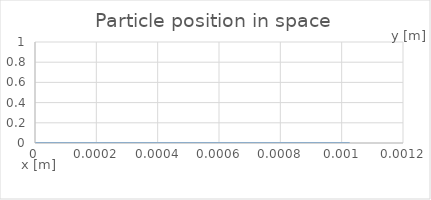
| Category | Position |
|---|---|
| 0.0 | 0 |
| 1.0849708527211375e-06 | 0 |
| 2.0657940694101187e-06 | 0 |
| 2.95841799307969e-06 | 0 |
| 3.807688500268434e-06 | 0 |
| 4.6528456158184445e-06 | 0 |
| 5.515061530573464e-06 | 0 |
| 6.398412354118242e-06 | 0 |
| 7.2631853016606325e-06 | 0 |
| 8.149474777894756e-06 | 0 |
| 9.06891409328116e-06 | 0 |
| 1.001395492328489e-05 | 0 |
| 1.0970207049510458e-05 | 0 |
| 1.1925712499326183e-05 | 0 |
| 1.2874813678204127e-05 | 0 |
| 1.3817397214790802e-05 | 0 |
| 1.4756151180294727e-05 | 0 |
| 1.5694021919839908e-05 | 0 |
| 1.6632881993865335e-05 | 0 |
| 1.7573248578469382e-05 | 0 |
| 1.851474282102202e-05 | 0 |
| 1.945669407357349e-05 | 0 |
| 2.0398567234390694e-05 | 0 |
| 2.1340122745158912e-05 | 0 |
| 2.2281366889895705e-05 | 0 |
| 2.322242795579233e-05 | 0 |
| 2.4163440636364245e-05 | 0 |
| 2.5104487780952476e-05 | 0 |
| 2.6045586222522e-05 | 0 |
| 2.698671658315851e-05 | 0 |
| 2.792784457173047e-05 | 0 |
| 2.8868948392686187e-05 | 0 |
| 2.9810020244844562e-05 | 0 |
| 3.07510649032022e-05 | 0 |
| 3.169208682441906e-05 | 0 |
| 3.2633094216652706e-05 | 0 |
| 3.357408734569741e-05 | 0 |
| 3.4515067902574924e-05 | 0 |
| 3.5456033142234034e-05 | 0 |
| 3.639698281603354e-05 | 0 |
| 3.7337916092579194e-05 | 0 |
| 3.827883270087771e-05 | 0 |
| 3.921973392364139e-05 | 0 |
| 4.016062871923654e-05 | 0 |
| 4.1101521575132224e-05 | 0 |
| 4.2042406336622134e-05 | 0 |
| 4.298327871609407e-05 | 0 |
| 4.3924136106745105e-05 | 0 |
| 4.486497587201077e-05 | 0 |
| 4.5805796906071405e-05 | 0 |
| 4.674660122910131e-05 | 0 |
| 4.768739000289194e-05 | 0 |
| 4.862816200557467e-05 | 0 |
| 4.9568919923315804e-05 | 0 |
| 5.050966366069588e-05 | 0 |
| 5.145039302596966e-05 | 0 |
| 5.2391228358878946e-05 | 0 |
| 5.3332177263615086e-05 | 0 |
| 5.427319118135362e-05 | 0 |
| 5.521421094729839e-05 | 0 |
| 5.615519656296111e-05 | 0 |
| 5.7096146549592635e-05 | 0 |
| 5.803706898391094e-05 | 0 |
| 5.897796395640177e-05 | 0 |
| 5.991883465092693e-05 | 0 |
| 6.0859121547263277e-05 | 0 |
| 6.179878641651572e-05 | 0 |
| 6.273804878815809e-05 | 0 |
| 6.367720665766775e-05 | 0 |
| 6.46164334151532e-05 | 0 |
| 6.555578018990172e-05 | 0 |
| 6.649521725106576e-05 | 0 |
| 6.743468239568371e-05 | 0 |
| 6.837412915709868e-05 | 0 |
| 6.931353460281128e-05 | 0 |
| 7.02531285715835e-05 | 0 |
| 7.119294232869318e-05 | 0 |
| 7.213246735481581e-05 | 0 |
| 7.307153353891135e-05 | 0 |
| 7.401024099773768e-05 | 0 |
| 7.494878540912699e-05 | 0 |
| 7.588732314938814e-05 | 0 |
| 7.682593150848681e-05 | 0 |
| 7.7764611490593e-05 | 0 |
| 7.870332796225495e-05 | 0 |
| 7.964204114813501e-05 | 0 |
| 8.058068668913666e-05 | 0 |
| 8.151908388044625e-05 | 0 |
| 8.245723931176603e-05 | 0 |
| 8.33952489781963e-05 | 0 |
| 8.433321759970894e-05 | 0 |
| 8.527120752250843e-05 | 0 |
| 8.620923472438315e-05 | 0 |
| 8.7147284907374e-05 | 0 |
| 8.808533430447047e-05 | 0 |
| 8.902336658674276e-05 | 0 |
| 8.996137408306554e-05 | 0 |
| 9.089940657328803e-05 | 0 |
| 9.183747085678422e-05 | 0 |
| 9.277555100030863e-05 | 0 |
| 9.371362719129207e-05 | 0 |
| 9.465168349322245e-05 | 0 |
| 9.5589713824809e-05 | 0 |
| 9.6527719598304e-05 | 0 |
| 9.746566553629115e-05 | 0 |
| 9.840355357504977e-05 | 0 |
| 9.934140250533372e-05 | 0 |
| 0.00010027923048989885 | 0 |
| 0.00010121704892739054 | 0 |
| 0.00010215486069824894 | 0 |
| 0.00010309266330946785 | 0 |
| 0.00010403045458420995 | 0 |
| 0.00010496823005482635 | 0 |
| 0.00010590598685176727 | 0 |
| 0.0001068437241060166 | 0 |
| 0.00010778144337926773 | 0 |
| 0.00010871914595847138 | 0 |
| 0.00010965683263975685 | 0 |
| 0.0001105945041732376 | 0 |
| 0.00011153215605715231 | 0 |
| 0.00011246978772630278 | 0 |
| 0.00011340740181779955 | 0 |
| 0.00011434500014089241 | 0 |
| 0.00011528261106181216 | 0 |
| 0.00011622030374655903 | 0 |
| 0.00011715807252590486 | 0 |
| 0.00011809587629748863 | 0 |
| 0.00011903367245038118 | 0 |
| 0.00011997143499540204 | 0 |
| 0.0001209091595223687 | 0 |
| 0.00012184685276228505 | 0 |
| 0.00012278452420301796 | 0 |
| 0.00012372218233953805 | 0 |
| 0.000124659830640406 | 0 |
| 0.00012559746786599567 | 0 |
| 0.00012653509243374585 | 0 |
| 0.00012747269790130478 | 0 |
| 0.00012841029039815653 | 0 |
| 0.00012934774543789078 | 0 |
| 0.00013028505273619294 | 0 |
| 0.00013122211147667296 | 0 |
| 0.00013215896826201636 | 0 |
| 0.00013309572510635691 | 0 |
| 0.0001340324686887363 | 0 |
| 0.00013496923942736327 | 0 |
| 0.00013590604004524637 | 0 |
| 0.00013684284584133347 | 0 |
| 0.00013777963609219447 | 0 |
| 0.00013871640086828593 | 0 |
| 0.00013965313822566423 | 0 |
| 0.000140589853571836 | 0 |
| 0.00014152655167057592 | 0 |
| 0.0001424632335333743 | 0 |
| 0.0001433998999404217 | 0 |
| 0.00014433655155678913 | 0 |
| 0.00014527318798320758 | 0 |
| 0.00014620335687511696 | 0 |
| 0.00014712651893786672 | 0 |
| 0.00014804529881639407 | 0 |
| 0.00014896280420165957 | 0 |
| 0.0001498811028998539 | 0 |
| 0.0001508008979395992 | 0 |
| 0.00015172192145826552 | 0 |
| 0.000152656057434416 | 0 |
| 0.00015360379436791564 | 0 |
| 0.000154559656213673 | 0 |
| 0.00015551744617722574 | 0 |
| 0.000156473235906426 | 0 |
| 0.0001574259071782128 | 0 |
| 0.00015837621620307785 | 0 |
| 0.00015932553820690378 | 0 |
| 0.00016027497396481488 | 0 |
| 0.00016122501939005676 | 0 |
| 0.00016220292424044206 | 0 |
| 0.00016321031952250218 | 0 |
| 0.00016423494633819517 | 0 |
| 0.00016526285352261985 | 0 |
| 0.00016628555832144603 | 0 |
| 0.0001673011931898251 | 0 |
| 0.00016831203553360817 | 0 |
| 0.00016932138633747202 | 0 |
| 0.00017033156291650352 | 0 |
| 0.00017134334011546687 | 0 |
| 0.00017235637751029863 | 0 |
| 0.0001733699295910405 | 0 |
| 0.00017438338480428012 | 0 |
| 0.0001753964747399114 | 0 |
| 0.00017640922311433407 | 0 |
| 0.00017742178893696343 | 0 |
| 0.00017843433070769012 | 0 |
| 0.00017944693273531253 | 0 |
| 0.0001804596119912956 | 0 |
| 0.00018147233517130208 | 0 |
| 0.00018248505655068956 | 0 |
| 0.00018349774984497062 | 0 |
| 0.00018451040780962283 | 0 |
| 0.0001855230367580014 | 0 |
| 0.00018653564720953503 | 0 |
| 0.00018754824609096719 | 0 |
| 0.00018856083524440253 | 0 |
| 0.0001895734155546879 | 0 |
| 0.00019058598455294403 | 0 |
| 0.00019159853920194169 | 0 |
| 0.00019261107859578283 | 0 |
| 0.0001936236043486347 | 0 |
| 0.00019463611731642438 | 0 |
| 0.00019564861635809272 | 0 |
| 0.00019668248552275319 | 0 |
| 0.00019775610373996992 | 0 |
| 0.00019885995142041325 | 0 |
| 0.00019997456814416489 | 0 |
| 0.0002010848804515392 | 0 |
| 0.00020218547958004523 | 0 |
| 0.00020327844395698902 | 0 |
| 0.00020437557105147943 | 0 |
| 0.00020548071320839712 | 0 |
| 0.00020659184723450117 | 0 |
| 0.00020770498667400193 | 0 |
| 0.00020881713258545705 | 0 |
| 0.00020992726837595126 | 0 |
| 0.0002110358713316323 | 0 |
| 0.00021214392669178112 | 0 |
| 0.00021325218773596966 | 0 |
| 0.00021436091686350255 | 0 |
| 0.00021547000419360184 | 0 |
| 0.00021657921770806425 | 0 |
| 0.00021768836559171904 | 0 |
| 0.0002187973748961724 | 0 |
| 0.00021990626605217104 | 0 |
| 0.00022101509701441668 | 0 |
| 0.000222123917616828 | 0 |
| 0.00022323274556007623 | 0 |
| 0.00022434157440713392 | 0 |
| 0.000225450390030715 | 0 |
| 0.000226559178778232 | 0 |
| 0.000227667937644675 | 0 |
| 0.0002287766699292555 | 0 |
| 0.000229885379194745 | 0 |
| 0.00023099410656091235 | 0 |
| 0.00023210293694940574 | 0 |
| 0.00023321185026446698 | 0 |
| 0.00023432078420322373 | 0 |
| 0.00023542967587982238 | 0 |
| 0.00023653850324224579 | 0 |
| 0.00023764727865428767 | 0 |
| 0.00023874810650296763 | 0 |
| 0.00023984095251468833 | 0 |
| 0.00024092969608032955 | 0 |
| 0.00024201826826971115 | 0 |
| 0.00024310870561982908 | 0 |
| 0.0002442011253584686 | 0 |
| 0.00024529461153917326 | 0 |
| 0.0002463881725279977 | 0 |
| 0.0002474812668309382 | 0 |
| 0.00024857384522029315 | 0 |
| 0.0002496661143324798 | 0 |
| 0.0002507583185810692 | 0 |
| 0.00025185060404824493 | 0 |
| 0.0002528946618471488 | 0 |
| 0.0002538724375607984 | 0 |
| 0.00025481329225903186 | 0 |
| 0.00025572968892534196 | 0 |
| 0.0002566379900219161 | 0 |
| 0.00025754966487661956 | 0 |
| 0.00025846905564946897 | 0 |
| 0.0002593951701734181 | 0 |
| 0.00026032473785507645 | 0 |
| 0.00026125468572395124 | 0 |
| 0.00026218331125392463 | 0 |
| 0.00026311030706394376 | 0 |
| 0.00026403617546914046 | 0 |
| 0.00026496162749497945 | 0 |
| 0.0002658871852695946 | 0 |
| 0.00026681305585216065 | 0 |
| 0.0002677392058996091 | 0 |
| 0.00026866549672901135 | 0 |
| 0.00026959179238588864 | 0 |
| 0.0002705180170249279 | 0 |
| 0.00027144415561627326 | 0 |
| 0.0002723702274613146 | 0 |
| 0.0002732962625332174 | 0 |
| 0.0002742222866915458 | 0 |
| 0.0002751483108629217 | 0 |
| 0.00027607433259426253 | 0 |
| 0.000277000344247191 | 0 |
| 0.000277926340679755 | 0 |
| 0.00027885231623238165 | 0 |
| 0.0002797782701126585 | 0 |
| 0.0002807039096013685 | 0 |
| 0.0002816292102277968 | 0 |
| 0.00028255429379332584 | 0 |
| 0.0002834793023178841 | 0 |
| 0.0002844043304573562 | 0 |
| 0.00028532941202762016 | 0 |
| 0.00028625453457808866 | 0 |
| 0.0002871796660336826 | 0 |
| 0.00028810478046086647 | 0 |
| 0.00028902986604089064 | 0 |
| 0.00028995492073874933 | 0 |
| 0.000290879949110922 | 0 |
| 0.0002918049579667334 | 0 |
| 0.0002927299518309573 | 0 |
| 0.0002936549323519714 | 0 |
| 0.00029457989937142044 | 0 |
| 0.0002955048485871665 | 0 |
| 0.00029642978050686017 | 0 |
| 0.0002973546954341784 | 0 |
| 0.00029827959405329503 | 0 |
| 0.0002992044754083915 | 0 |
| 0.0003001293386422276 | 0 |
| 0.00030105417205932277 | 0 |
| 0.0003019789220634248 | 0 |
| 0.0003029035978271135 | 0 |
| 0.00030382822560546624 | 0 |
| 0.0003047528313451618 | 0 |
| 0.0003056774320159479 | 0 |
| 0.0003066020305679692 | 0 |
| 0.0003075266222794467 | 0 |
| 0.0003084512005679024 | 0 |
| 0.0003093937389795628 | 0 |
| 0.0003103557282650236 | 0 |
| 0.00031132964992261036 | 0 |
| 0.00031230657972979156 | 0 |
| 0.00031326275769383153 | 0 |
| 0.00031419525169156974 | 0 |
| 0.00031513054947128374 | 0 |
| 0.00031608072073027255 | 0 |
| 0.00031704553540723066 | 0 |
| 0.00031801861909680425 | 0 |
| 0.00031899320189316576 | 0 |
| 0.00031996523996449084 | 0 |
| 0.00032093381122571987 | 0 |
| 0.00032189994758064525 | 0 |
| 0.00032286521035646476 | 0 |
| 0.0003238306984450858 | 0 |
| 0.00032479685790509584 | 0 |
| 0.000325763612971166 | 0 |
| 0.00032673066379353236 | 0 |
| 0.00032769772437419605 | 0 |
| 0.0003286646409096528 | 0 |
| 0.0003296313906750748 | 0 |
| 0.0003305800452206826 | 0 |
| 0.0003315093659207195 | 0 |
| 0.0003324268311123679 | 0 |
| 0.00033334106141168094 | 0 |
| 0.0003342576809068817 | 0 |
| 0.00033517851903254025 | 0 |
| 0.00033610275203974684 | 0 |
| 0.00033704654614495643 | 0 |
| 0.0003380098246078967 | 0 |
| 0.0003389842463992511 | 0 |
| 0.0003399428299331851 | 0 |
| 0.0003408968950353098 | 0 |
| 0.00034183603805604723 | 0 |
| 0.00034277934179384635 | 0 |
| 0.00034373459373720827 | 0 |
| 0.00034470061448675345 | 0 |
| 0.0003456721903624417 | 0 |
| 0.0003466263190856998 | 0 |
| 0.0003475589902560722 | 0 |
| 0.0003484772294016648 | 0 |
| 0.0003493905018279771 | 0 |
| 0.0003503055642018231 | 0 |
| 0.0003512250549339236 | 0 |
| 0.0003521664607953938 | 0 |
| 0.00035312941500016654 | 0 |
| 0.00035408658187410173 | 0 |
| 0.0003550267685999451 | 0 |
| 0.0003559695491945957 | 0 |
| 0.0003569236074259575 | 0 |
| 0.0003578885052253955 | 0 |
| 0.00035885937247560467 | 0 |
| 0.000359813509943091 | 0 |
| 0.00036078569191687473 | 0 |
| 0.0003617855364440112 | 0 |
| 0.0003628058701753597 | 0 |
| 0.00036382336656301393 | 0 |
| 0.00036482764537544343 | 0 |
| 0.0003658194714314465 | 0 |
| 0.00036680476372258537 | 0 |
| 0.00036778935784459774 | 0 |
| 0.00036877732075312776 | 0 |
| 0.0003697747502047238 | 0 |
| 0.0003707804940270399 | 0 |
| 0.0003717902491386285 | 0 |
| 0.00037280005142978253 | 0 |
| 0.00037380788780631423 | 0 |
| 0.0003748344773244411 | 0 |
| 0.0003758816549137392 | 0 |
| 0.0003769408001138927 | 0 |
| 0.0003780019691031074 | 0 |
| 0.0003790592228490721 | 0 |
| 0.0003801114356822483 | 0 |
| 0.0003811604088472831 | 0 |
| 0.0003822085548089374 | 0 |
| 0.0003832574572082597 | 0 |
| 0.0003843075460798974 | 0 |
| 0.0003853584704305074 | 0 |
| 0.0003864096567476039 | 0 |
| 0.00038746068616023357 | 0 |
| 0.00038851141387277494 | 0 |
| 0.00038956190777659583 | 0 |
| 0.0003906123030348995 | 0 |
| 0.0003916627089447929 | 0 |
| 0.00039271316120087057 | 0 |
| 0.00039376364928780255 | 0 |
| 0.0003948141431529998 | 0 |
| 0.00039586461370359847 | 0 |
| 0.00039691504817177843 | 0 |
| 0.00039796544942987723 | 0 |
| 0.0003990158273225588 | 0 |
| 0.00040006620061142344 | 0 |
| 0.0004011165732783904 | 0 |
| 0.00040216693901092866 | 0 |
| 0.0004032172892690418 | 0 |
| 0.0004042676203766555 | 0 |
| 0.0004053179314866976 | 0 |
| 0.00040636822111281073 | 0 |
| 0.0004074184899716926 | 0 |
| 0.0004084687495689362 | 0 |
| 0.0004095190003376968 | 0 |
| 0.00041056923833836495 | 0 |
| 0.00041161945750562 | 0 |
| 0.0004126696572190898 | 0 |
| 0.00041371983832866034 | 0 |
| 0.00041477624541827853 | 0 |
| 0.0004158390814356193 | 0 |
| 0.00041690684023090594 | 0 |
| 0.00041797642066915627 | 0 |
| 0.0004190453944892372 | 0 |
| 0.0004201128267371434 | 0 |
| 0.00042117897692529145 | 0 |
| 0.00042224457850155385 | 0 |
| 0.0004233102491388248 | 0 |
| 0.00042437626857725675 | 0 |
| 0.0004254426022181635 | 0 |
| 0.0004265090775343032 | 0 |
| 0.00042757553252973854 | 0 |
| 0.000428641889171025 | 0 |
| 0.0004297081782902127 | 0 |
| 0.00043077444052240786 | 0 |
| 0.0004318407033330355 | 0 |
| 0.00043290697195475734 | 0 |
| 0.0004339732365286488 | 0 |
| 0.000435039483585572 | 0 |
| 0.0004360927119958646 | 0 |
| 0.0004371325710763894 | 0 |
| 0.00043816511981250753 | 0 |
| 0.0004391967593045066 | 0 |
| 0.0004402310981229751 | 0 |
| 0.0004412686845757861 | 0 |
| 0.000442308266513615 | 0 |
| 0.00044334826162177517 | 0 |
| 0.0004443876779106009 | 0 |
| 0.0004454262790434599 | 0 |
| 0.0004464643125164579 | 0 |
| 0.00044750215488249107 | 0 |
| 0.0004485400719940131 | 0 |
| 0.00044957816509459225 | 0 |
| 0.00045061639432910646 | 0 |
| 0.00045165463418179866 | 0 |
| 0.0004526928074387048 | 0 |
| 0.0004537308941720292 | 0 |
| 0.0004547689164120408 | 0 |
| 0.0004558069044419628 | 0 |
| 0.00045684487923201877 | 0 |
| 0.00045788284593058215 | 0 |
| 0.0004589213387903405 | 0 |
| 0.0004599603712179416 | 0 |
| 0.0004609996904024617 | 0 |
| 0.00046203902655909815 | 0 |
| 0.00046307822626747114 | 0 |
| 0.00046411726655462836 | 0 |
| 0.0004651561990653229 | 0 |
| 0.00046619495512798193 | 0 |
| 0.0004672335706841348 | 0 |
| 0.0004682721189828084 | 0 |
| 0.0004693106581269589 | 0 |
| 0.0004703492131881507 | 0 |
| 0.00047138777903659834 | 0 |
| 0.00047241777534655425 | 0 |
| 0.0004734388582047499 | 0 |
| 0.0004744634723576026 | 0 |
| 0.00047548765895815873 | 0 |
| 0.0004765181802632035 | 0 |
| 0.0004775555038033277 | 0 |
| 0.000478596709703994 | 0 |
| 0.00047963852390835686 | 0 |
| 0.0004806790092283924 | 0 |
| 0.00048171780393458145 | 0 |
| 0.00048275550180527 | 0 |
| 0.0004837928977813441 | 0 |
| 0.0004848305188944097 | 0 |
| 0.00048586850351026287 | 0 |
| 0.00048690674192908447 | 0 |
| 0.000487945052818444 | 0 |
| 0.000488995638025577 | 0 |
| 0.0004900588648544134 | 0 |
| 0.0004911289418824655 | 0 |
| 0.0004921997049534127 | 0 |
| 0.0004932553892364242 | 0 |
| 0.0004942952583614715 | 0 |
| 0.0004953386838781463 | 0 |
| 0.000496393689404651 | 0 |
| 0.0004974379776793254 | 0 |
| 0.0004984565173895105 | 0 |
| 0.0004994319044419446 | 0 |
| 0.0005003746332535534 | 0 |
| 0.000501352163361431 | 0 |
| 0.0005023833000379661 | 0 |
| 0.0005034534040243128 | 0 |
| 0.0005044886165992881 | 0 |
| 0.0005054683936941631 | 0 |
| 0.0005064073847652898 | 0 |
| 0.0005073303726099725 | 0 |
| 0.0005082563883984796 | 0 |
| 0.0005091936893418729 | 0 |
| 0.0005101417029696006 | 0 |
| 0.0005111173591191004 | 0 |
| 0.0005120955110245536 | 0 |
| 0.0005130842232664966 | 0 |
| 0.0005140828848912366 | 0 |
| 0.0005150867661761454 | 0 |
| 0.0005160911585683277 | 0 |
| 0.0005170938515205168 | 0 |
| 0.0005180944905399574 | 0 |
| 0.0005190938065451944 | 0 |
| 0.000520092747687208 | 0 |
| 0.0005210919444866936 | 0 |
| 0.0005220915898011962 | 0 |
| 0.0005230915684124391 | 0 |
| 0.0005240916657316431 | 0 |
| 0.0005250917121169215 | 0 |
| 0.000526091630153685 | 0 |
| 0.0005271179543298027 | 0 |
| 0.0005281454760498949 | 0 |
| 0.0005291610295941638 | 0 |
| 0.000530163488393859 | 0 |
| 0.000531158175329052 | 0 |
| 0.0005321512060270486 | 0 |
| 0.000533146366662884 | 0 |
| 0.0005341445966347909 | 0 |
| 0.0005351449901053378 | 0 |
| 0.000536146243408051 | 0 |
| 0.0005371473135413811 | 0 |
| 0.0005381477515706092 | 0 |
| 0.0005391521587817222 | 0 |
| 0.0005401610524176664 | 0 |
| 0.000541172666739829 | 0 |
| 0.0005421848794952897 | 0 |
| 0.0005431963509947727 | 0 |
| 0.0005442067376005659 | 0 |
| 0.000545216258201924 | 0 |
| 0.0005462254057572976 | 0 |
| 0.0005472345850212189 | 0 |
| 0.000548243987388968 | 0 |
| 0.0005492536115221365 | 0 |
| 0.0005502633480935962 | 0 |
| 0.0005512730837752877 | 0 |
| 0.0005522827519585859 | 0 |
| 0.0005532923364843668 | 0 |
| 0.0005543018571442201 | 0 |
| 0.0005553113107645118 | 0 |
| 0.0005563207145818798 | 0 |
| 0.0005573300757916557 | 0 |
| 0.0005583652413406508 | 0 |
| 0.0005594273454643009 | 0 |
| 0.0005604930146162929 | 0 |
| 0.0005615488610732684 | 0 |
| 0.0005625928314722628 | 0 |
| 0.0005636294546264133 | 0 |
| 0.0005646643978624027 | 0 |
| 0.0005657012619075148 | 0 |
| 0.0005667409510745161 | 0 |
| 0.0005677825957516032 | 0 |
| 0.0005688248442703774 | 0 |
| 0.0005698667364082559 | 0 |
| 0.0005709079471449678 | 0 |
| 0.0005719486197666064 | 0 |
| 0.0005729890639348637 | 0 |
| 0.0005740295335044588 | 0 |
| 0.0005750701321405549 | 0 |
| 0.0005761108435891087 | 0 |
| 0.0005771515983006686 | 0 |
| 0.000578192332955731 | 0 |
| 0.0005792330139205266 | 0 |
| 0.0005802736392950893 | 0 |
| 0.0005813142232066276 | 0 |
| 0.0005823547837539233 | 0 |
| 0.0005833953434148248 | 0 |
| 0.0005844359038239512 | 0 |
| 0.000585476457025068 | 0 |
| 0.0005865169894802233 | 0 |
| 0.0005875574958216277 | 0 |
| 0.0005885968686863951 | 0 |
| 0.0005896350696656305 | 0 |
| 0.0005906726145692991 | 0 |
| 0.0005917100566166812 | 0 |
| 0.0005927496115798286 | 0 |
| 0.0005937917938023644 | 0 |
| 0.0005948356303214034 | 0 |
| 0.000595879855370152 | 0 |
| 0.0005969236564193073 | 0 |
| 0.0005979668169723508 | 0 |
| 0.0005990095181660698 | 0 |
| 0.0006000520527826886 | 0 |
| 0.0006010946886535659 | 0 |
| 0.0006021375023489817 | 0 |
| 0.0006031804389803584 | 0 |
| 0.0006042234068022805 | 0 |
| 0.0006052663362075979 | 0 |
| 0.0006063091996437701 | 0 |
| 0.0006073520053691638 | 0 |
| 0.0006083947725674751 | 0 |
| 0.0006094375188682057 | 0 |
| 0.000610480260814885 | 0 |
| 0.0006115230079043493 | 0 |
| 0.0006125657514345171 | 0 |
| 0.0006136084798065535 | 0 |
| 0.0006146511863393097 | 0 |
| 0.0006156938677898507 | 0 |
| 0.0006167365250380022 | 0 |
| 0.0006177791591576875 | 0 |
| 0.0006187743750112638 | 0 |
| 0.000619720031059838 | 0 |
| 0.0006206365173432752 | 0 |
| 0.000621546142261899 | 0 |
| 0.0006224628485202577 | 0 |
| 0.0006233906223460728 | 0 |
| 0.000624326893655713 | 0 |
| 0.0006252668322503619 | 0 |
| 0.0006262064785640555 | 0 |
| 0.0006271666150778561 | 0 |
| 0.0006281489342479485 | 0 |
| 0.000629144656284475 | 0 |
| 0.000630143466068491 | 0 |
| 0.0006311388189797256 | 0 |
| 0.000632128974401191 | 0 |
| 0.000633115353768063 | 0 |
| 0.000634100475606844 | 0 |
| 0.0006350861463125221 | 0 |
| 0.0006360730170136455 | 0 |
| 0.0006370664824274767 | 0 |
| 0.0006380663160026963 | 0 |
| 0.0006390695642219411 | 0 |
| 0.0006400732132243146 | 0 |
| 0.0006410755627635911 | 0 |
| 0.0006420763368326393 | 0 |
| 0.0006430760899528355 | 0 |
| 0.0006440755455841356 | 0 |
| 0.0006450625923923403 | 0 |
| 0.0006460366659854449 | 0 |
| 0.0006470031535519904 | 0 |
| 0.0006479453804348513 | 0 |
| 0.0006488653321392409 | 0 |
| 0.0006497732496995516 | 0 |
| 0.0006506791564015661 | 0 |
| 0.0006515888582986947 | 0 |
| 0.0006525037107852399 | 0 |
| 0.0006534222845191509 | 0 |
| 0.0006543649791851855 | 0 |
| 0.0006553319711202504 | 0 |
| 0.0006562903378527891 | 0 |
| 0.0006572273141152676 | 0 |
| 0.0006581682028437693 | 0 |
| 0.0006591013598030499 | 0 |
| 0.0006600468363055198 | 0 |
| 0.0006610094812459139 | 0 |
| 0.0006619843978549756 | 0 |
| 0.0006629638215936963 | 0 |
| 0.0006639418962385451 | 0 |
| 0.0006649163323100268 | 0 |
| 0.0006658648705635888 | 0 |
| 0.0006668101351671728 | 0 |
| 0.0006677648122218798 | 0 |
| 0.0006687368376302005 | 0 |
| 0.0006697227117905612 | 0 |
| 0.0006707146224036535 | 0 |
| 0.0006717060016077735 | 0 |
| 0.0006726937910564597 | 0 |
| 0.0006736780374257835 | 0 |
| 0.0006746603313567259 | 0 |
| 0.00067564231491335 | 0 |
| 0.0006766249363883571 | 0 |
| 0.0006776083807538263 | 0 |
| 0.0006785923689869572 | 0 |
| 0.000679576512299425 | 0 |
| 0.0006805605394965222 | 0 |
| 0.0006815443554466064 | 0 |
| 0.0006825279968667794 | 0 |
| 0.0006835115512863666 | 0 |
| 0.0006844950894664915 | 0 |
| 0.0006854786405594408 | 0 |
| 0.0006864622032937712 | 0 |
| 0.0006874457639348664 | 0 |
| 0.0006884293062228379 | 0 |
| 0.0006894128206111803 | 0 |
| 0.0006903963049039811 | 0 |
| 0.0006913797610697364 | 0 |
| 0.00069236319246407 | 0 |
| 0.0006933239513943928 | 0 |
| 0.000694266595364831 | 0 |
| 0.0006952010912555016 | 0 |
| 0.00069623980033203 | 0 |
| 0.0006973930033525511 | 0 |
| 0.0006986098231269986 | 0 |
| 0.0006998311585378692 | 0 |
| 0.0007010249949191927 | 0 |
| 0.0007021831833549355 | 0 |
| 0.0007033203558773996 | 0 |
| 0.0007044545995714133 | 0 |
| 0.0007055964352439823 | 0 |
| 0.0007067472622131127 | 0 |
| 0.0007079031706844479 | 0 |
| 0.0007090595830801931 | 0 |
| 0.0007102139425764567 | 0 |
| 0.0007113660205867899 | 0 |
| 0.0007125168690177635 | 0 |
| 0.0007136676393367149 | 0 |
| 0.0007148189405586237 | 0 |
| 0.0007159707986932733 | 0 |
| 0.0007171229335515995 | 0 |
| 0.0007182750574745027 | 0 |
| 0.0007194270239885506 | 0 |
| 0.0007205788348033633 | 0 |
| 0.0007217305632620407 | 0 |
| 0.0007228822654548767 | 0 |
| 0.0007240340098235357 | 0 |
| 0.0007251857997517806 | 0 |
| 0.0007263376074355551 | 0 |
| 0.0007274893947017601 | 0 |
| 0.0007286411451948249 | 0 |
| 0.0007297928641917109 | 0 |
| 0.0007309445623300805 | 0 |
| 0.0007320965893136578 | 0 |
| 0.0007332492100150175 | 0 |
| 0.0007344022450582889 | 0 |
| 0.0007355553834535159 | 0 |
| 0.0007367084088011565 | 0 |
| 0.0007378612647675575 | 0 |
| 0.000739014003401984 | 0 |
| 0.0007401667044403519 | 0 |
| 0.0007413138484230931 | 0 |
| 0.000742455522565153 | 0 |
| 0.0007435945547887913 | 0 |
| 0.0007447336966535052 | 0 |
| 0.0007458742621571358 | 0 |
| 0.00074701616643238 | 0 |
| 0.0007481586784073881 | 0 |
| 0.0007493011155394951 | 0 |
| 0.0007504431660826979 | 0 |
| 0.0007515848520424738 | 0 |
| 0.0007527263083274794 | 0 |
| 0.0007538677128332024 | 0 |
| 0.0007550091745195248 | 0 |
| 0.0007561507114921609 | 0 |
| 0.0007572922859238427 | 0 |
| 0.0007584338528177305 | 0 |
| 0.0007595753973684236 | 0 |
| 0.0007607169151945858 | 0 |
| 0.0007618584142457523 | 0 |
| 0.0007629998986527238 | 0 |
| 0.0007641413702625035 | 0 |
| 0.0007652828318766715 | 0 |
| 0.0007664242813018396 | 0 |
| 0.0007675657160504441 | 0 |
| 0.0007687071372401656 | 0 |
| 0.0007698485530309204 | 0 |
| 0.0007709899637694842 | 0 |
| 0.0007721313648625745 | 0 |
| 0.0007732727502770902 | 0 |
| 0.0007744141180483964 | 0 |
| 0.0007755554679961675 | 0 |
| 0.0007766968029921478 | 0 |
| 0.0007778381248985479 | 0 |
| 0.0007789794346451771 | 0 |
| 0.0007801207285023077 | 0 |
| 0.0007812620070731952 | 0 |
| 0.0007824032725035319 | 0 |
| 0.0007835445254196024 | 0 |
| 0.0007846867440652476 | 0 |
| 0.0007858299164333378 | 0 |
| 0.0007869734954285875 | 0 |
| 0.000788116992907447 | 0 |
| 0.0007892602008980284 | 0 |
| 0.0007904031540382633 | 0 |
| 0.0007915459921372098 | 0 |
| 0.0007926888369460336 | 0 |
| 0.0007938317384629101 | 0 |
| 0.0007949747504289967 | 0 |
| 0.000796117386409078 | 0 |
| 0.0007972595885914918 | 0 |
| 0.0007984015406655567 | 0 |
| 0.0007995434948409453 | 0 |
| 0.0008006855664198062 | 0 |
| 0.0008018277452068662 | 0 |
| 0.000802969966707124 | 0 |
| 0.0008041142755019026 | 0 |
| 0.000805260572744941 | 0 |
| 0.0008064076193848059 | 0 |
| 0.0008075544060707179 | 0 |
| 0.0008087005529216445 | 0 |
| 0.0008098461903630624 | 0 |
| 0.0008109916383844358 | 0 |
| 0.0008121371437063854 | 0 |
| 0.0008132827929180475 | 0 |
| 0.0008144285497861451 | 0 |
| 0.0008155743252791069 | 0 |
| 0.0008167200542321178 | 0 |
| 0.0008178657208103902 | 0 |
| 0.000819011342303678 | 0 |
| 0.0008201569419782667 | 0 |
| 0.000821302536331675 | 0 |
| 0.000822448128305194 | 0 |
| 0.0008235937131428638 | 0 |
| 0.0008247392841510229 | 0 |
| 0.0008258848401242954 | 0 |
| 0.0008270303799423507 | 0 |
| 0.0008281759018699794 | 0 |
| 0.0008293014139402184 | 0 |
| 0.0008304070549514785 | 0 |
| 0.0008315027806473735 | 0 |
| 0.0008325984318940369 | 0 |
| 0.0008336989608783485 | 0 |
| 0.0008348044470345179 | 0 |
| 0.0008359124758529205 | 0 |
| 0.0008370205769736407 | 0 |
| 0.0008381274729523032 | 0 |
| 0.0008392331124067403 | 0 |
| 0.0008403380845657476 | 0 |
| 0.0008414430025633893 | 0 |
| 0.0008425481922417371 | 0 |
| 0.0008436499319997133 | 0 |
| 0.0008447480520793794 | 0 |
| 0.0008458442372187681 | 0 |
| 0.0008469402724400708 | 0 |
| 0.0008480371148749197 | 0 |
| 0.0008491347058651897 | 0 |
| 0.0008502326420251129 | 0 |
| 0.0008513305437477403 | 0 |
| 0.0008524282323343245 | 0 |
| 0.0008535257152004571 | 0 |
| 0.0008546268418267068 | 0 |
| 0.0008557317401784235 | 0 |
| 0.000856838609788969 | 0 |
| 0.0008579455711914516 | 0 |
| 0.0008590516312891978 | 0 |
| 0.0008601567318031222 | 0 |
| 0.0008612613089768517 | 0 |
| 0.0008623658302419977 | 0 |
| 0.0008634705508502895 | 0 |
| 0.000864575492125367 | 0 |
| 0.000865680550165047 | 0 |
| 0.0008667856020851451 | 0 |
| 0.0008678905573095537 | 0 |
| 0.0008689954106878363 | 0 |
| 0.0008701002027259374 | 0 |
| 0.0008712049773821924 | 0 |
| 0.000872309755433991 | 0 |
| 0.0008734145388293344 | 0 |
| 0.0008745193193582935 | 0 |
| 0.0008756240877797339 | 0 |
| 0.0008767288425990949 | 0 |
| 0.0008778335809652898 | 0 |
| 0.0008789383029911167 | 0 |
| 0.0008800430088016799 | 0 |
| 0.0008811478092591051 | 0 |
| 0.0008822535061758983 | 0 |
| 0.0008833600499397048 | 0 |
| 0.0008844669910815809 | 0 |
| 0.0008855739011248528 | 0 |
| 0.000886680573036237 | 0 |
| 0.0008877870140535123 | 0 |
| 0.0008888933337632364 | 0 |
| 0.0008899996393993651 | 0 |
| 0.0008911059800895411 | 0 |
| 0.000892212355193275 | 0 |
| 0.0008933187401374238 | 0 |
| 0.0008944251104667822 | 0 |
| 0.0008955314539702149 | 0 |
| 0.0008966377712548991 | 0 |
| 0.0008977440655831176 | 0 |
| 0.000898850341710219 | 0 |
| 0.0008999566041000952 | 0 |
| 0.0009010628543950083 | 0 |
| 0.0009021497402518957 | 0 |
| 0.0009032170562565455 | 0 |
| 0.0009042741050707662 | 0 |
| 0.0009053303981995407 | 0 |
| 0.000906391044676948 | 0 |
| 0.0009074565451620759 | 0 |
| 0.0009085248397329554 | 0 |
| 0.0009095935649960124 | 0 |
| 0.0009106613277702397 | 0 |
| 0.0009117278843854979 | 0 |
| 0.0009127936844942452 | 0 |
| 0.0009138593062399579 | 0 |
| 0.0009149251172278264 | 0 |
| 0.0009159912058276159 | 0 |
| 0.0009170574771020119 | 0 |
| 0.0009181237943899667 | 0 |
| 0.000919190062166277 | 0 |
| 0.0009202562483969517 | 0 |
| 0.0009213223719433011 | 0 |
| 0.0009223884667070827 | 0 |
| 0.0009234545563132924 | 0 |
| 0.0009245206498325687 | 0 |
| 0.0009255868894623799 | 0 |
| 0.0009266532672677712 | 0 |
| 0.0009277197065634522 | 0 |
| 0.0009287861375338032 | 0 |
| 0.0009298525236840693 | 0 |
| 0.0009309188615937041 | 0 |
| 0.0009319851664563134 | 0 |
| 0.0009330514575322613 | 0 |
| 0.0009341177438294992 | 0 |
| 0.0009351840259962276 | 0 |
| 0.0009362503013395229 | 0 |
| 0.0009373165657448021 | 0 |
| 0.0009383828164073793 | 0 |
| 0.0009394490549159884 | 0 |
| 0.0009405152843831169 | 0 |
| 0.0009415815042519615 | 0 |
| 0.0009426477132812188 | 0 |
| 0.0009437139108167814 | 0 |
| 0.0009447800790077127 | 0 |
| 0.0009458462184997276 | 0 |
| 0.0009469123535465091 | 0 |
| 0.0009479784946867278 | 0 |
| 0.0009490446415528552 | 0 |
| 0.0009501107853803147 | 0 |
| 0.0009511769056660319 | 0 |
| 0.0009522430001589232 | 0 |
| 0.0009533092304968583 | 0 |
| 0.0009543756081082703 | 0 |
| 0.0009554420628375264 | 0 |
| 0.0009565085170506662 | 0 |
| 0.0009575749269647716 | 0 |
| 0.0009586409062877059 | 0 |
| 0.000959706461584795 | 0 |
| 0.0009607717942842786 | 0 |
| 0.0009618371044672172 | 0 |
| 0.0009629024976507562 | 0 |
| 0.000963967982218132 | 0 |
| 0.0009650335144919947 | 0 |
| 0.0009660990471159415 | 0 |
| 0.0009671645512077063 | 0 |
| 0.0009682300199606791 | 0 |
| 0.0009692954623128774 | 0 |
| 0.0009703608908403209 | 0 |
| 0.0009714263122767434 | 0 |
| 0.0009724917295392127 | 0 |
| 0.0009735571417143874 | 0 |
| 0.000974639734675083 | 0 |
| 0.0009757398672089905 | 0 |
| 0.0009768491695236654 | 0 |
| 0.0009779570883814994 | 0 |
| 0.000979059024512177 | 0 |
| 0.0009801556235705673 | 0 |
| 0.000981249814549593 | 0 |
| 0.0009823442325152699 | 0 |
| 0.000983440074565661 | 0 |
| 0.0009845372363703282 | 0 |
| 0.000985637497207761 | 0 |
| 0.000986737283575623 | 0 |
| 0.0009878339900217569 | 0 |
| 0.0009889278188278219 | 0 |
| 0.0009900202702837761 | 0 |
| 0.0009911127616623867 | 0 |
| 0.0009922059756830503 | 0 |
| 0.000993299894906781 | 0 |
| 0.000994394160779388 | 0 |
| 0.0009954884177890617 | 0 |
| 0.0009965824879846327 | 0 |
| 0.0009976763684807703 | 0 |
| 0.0009987701436677584 | 0 |
| 0.0009998638963226254 | 0 |
| 0.0010009576730205126 | 0 |
| 0.0010020514942435943 | 0 |
| 0.001003145349288106 | 0 |
| 0.0010042392110711808 | 0 |
| 0.0010053330547256248 | 0 |
| 0.0010064268723986218 | 0 |
| 0.0010075206652592824 | 0 |
| 0.0010086144411722033 | 0 |
| 0.0010097082075498764 | 0 |
| 0.0010108019654221348 | 0 |
| 0.0010118957145677516 | 0 |
| 0.0010129894505677705 | 0 |
| 0.001014083176105288 | 0 |
| 0.0010151768931459795 | 0 |
| 0.0010162706001702459 | 0 |
| 0.0010173642882009618 | 0 |
| 0.0010184579553990643 | 0 |
| 0.0010195515655164644 | 0 |
| 0.0010206451224728274 | 0 |
| 0.0010217386502967532 | 0 |
| 0.0010228321687928803 | 0 |
| 0.0010239256856628646 | 0 |
| 0.001025019200564446 | 0 |
| 0.0010261127091834331 | 0 |